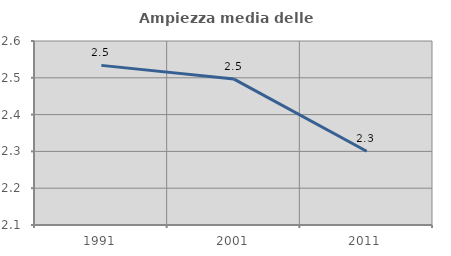
| Category | Ampiezza media delle famiglie |
|---|---|
| 1991.0 | 2.534 |
| 2001.0 | 2.496 |
| 2011.0 | 2.3 |